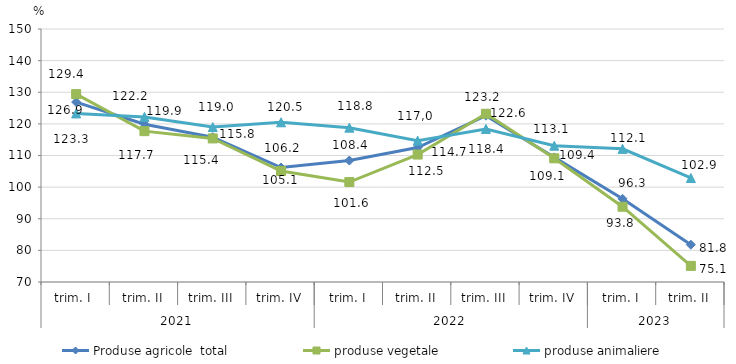
| Category | Produse agricole  total | produse vegetale | produse animaliere |
|---|---|---|---|
| 0 | 126.9 | 129.4 | 123.3 |
| 1 | 119.9 | 117.7 | 122.2 |
| 2 | 115.8 | 115.4 | 119 |
| 3 | 106.2 | 105.1 | 120.5 |
| 4 | 108.4 | 101.6 | 118.8 |
| 5 | 112.5 | 110.3 | 114.7 |
| 6 | 122.6 | 123.2 | 118.4 |
| 7 | 109.4 | 109.1 | 113.1 |
| 8 | 96.3 | 93.8 | 112.1 |
| 9 | 81.8 | 75.1 | 102.9 |